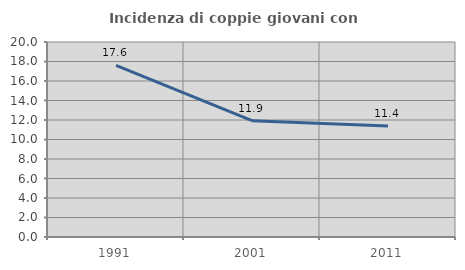
| Category | Incidenza di coppie giovani con figli |
|---|---|
| 1991.0 | 17.603 |
| 2001.0 | 11.927 |
| 2011.0 | 11.392 |